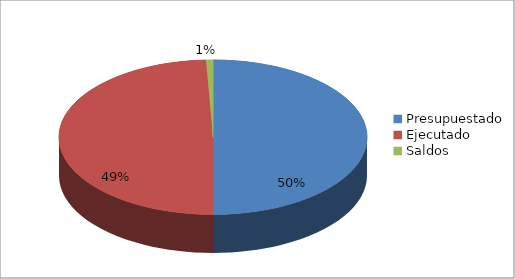
| Category | Series 0 |
|---|---|
| Presupuestado | 21095803458 |
| Ejecutado | 20789093188 |
| Saldos | 306710270 |